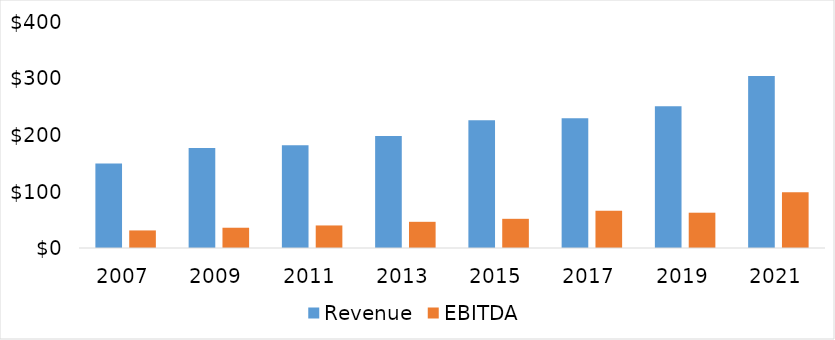
| Category | Revenue | EBITDA |
|---|---|---|
| 2007.0 | 149.4 | 31.1 |
| 2009.0 | 176.928 | 35.867 |
| 2011.0 | 181.801 | 39.898 |
| 2013.0 | 198.191 | 46.343 |
| 2015.0 | 226.124 | 51.66 |
| 2017.0 | 229.571 | 66.025 |
| 2019.0 | 250.857 | 62.471 |
| 2021.0 | 304.614 | 98.777 |